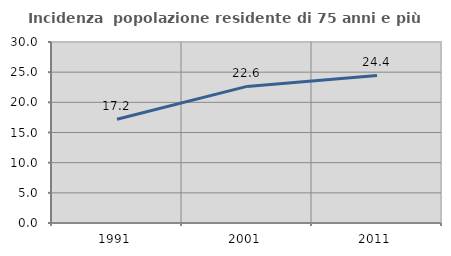
| Category | Incidenza  popolazione residente di 75 anni e più |
|---|---|
| 1991.0 | 17.209 |
| 2001.0 | 22.642 |
| 2011.0 | 24.448 |